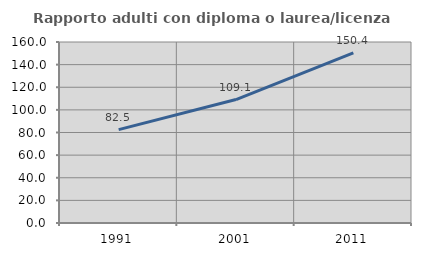
| Category | Rapporto adulti con diploma o laurea/licenza media  |
|---|---|
| 1991.0 | 82.536 |
| 2001.0 | 109.124 |
| 2011.0 | 150.421 |